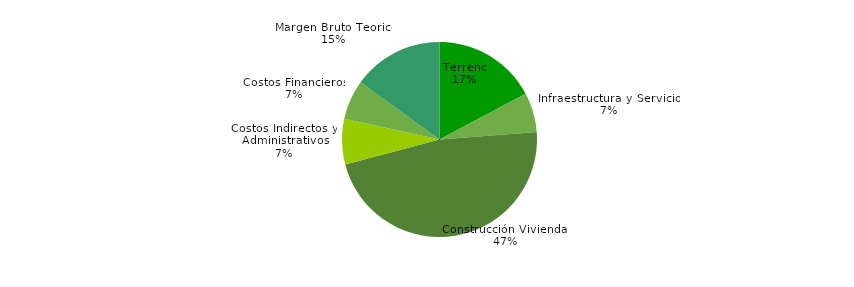
| Category | Series 0 |
|---|---|
| Terreno | 0.172 |
| Infraestructura y Servicios | 0.066 |
| Construcción Viviendas | 0.471 |
| Costos Indirectos y  Administrativos | 0.075 |
| Costos Financieros | 0.066 |
| Margen Bruto Teorico | 0.15 |